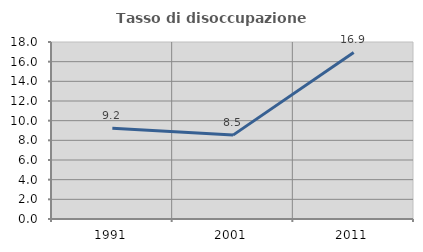
| Category | Tasso di disoccupazione giovanile  |
|---|---|
| 1991.0 | 9.231 |
| 2001.0 | 8.531 |
| 2011.0 | 16.94 |